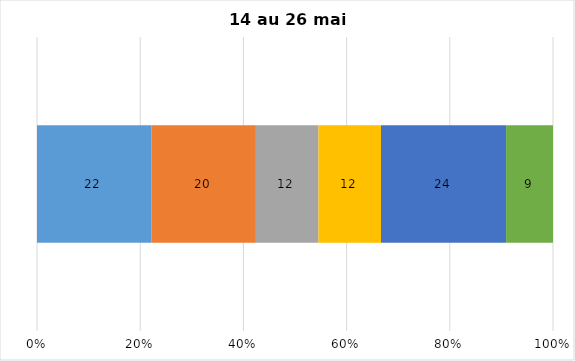
| Category | Plusieurs fois par jour | Une fois par jour | Quelques fois par semaine   | Une fois par semaine ou moins   |  Jamais   |  Je n’utilise pas les médias sociaux |
|---|---|---|---|---|---|---|
| 0 | 22 | 20 | 12 | 12 | 24 | 9 |